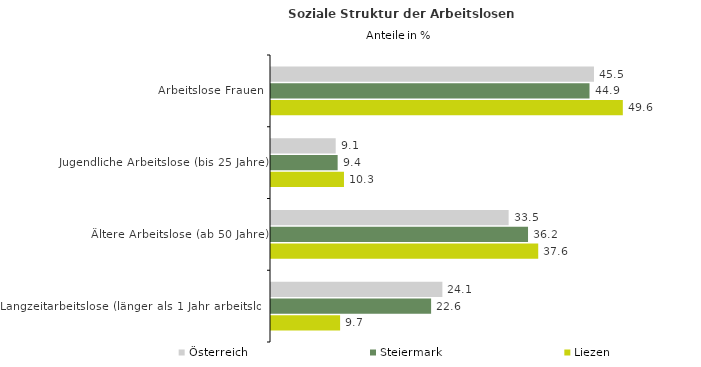
| Category | Österreich | Steiermark | Liezen |
|---|---|---|---|
| Arbeitslose Frauen | 45.49 | 44.861 | 49.553 |
| Jugendliche Arbeitslose (bis 25 Jahre) | 9.111 | 9.387 | 10.278 |
| Ältere Arbeitslose (ab 50 Jahre) | 33.469 | 36.201 | 37.637 |
| Langzeitarbeitslose (länger als 1 Jahr arbeitslos) | 24.136 | 22.55 | 9.732 |